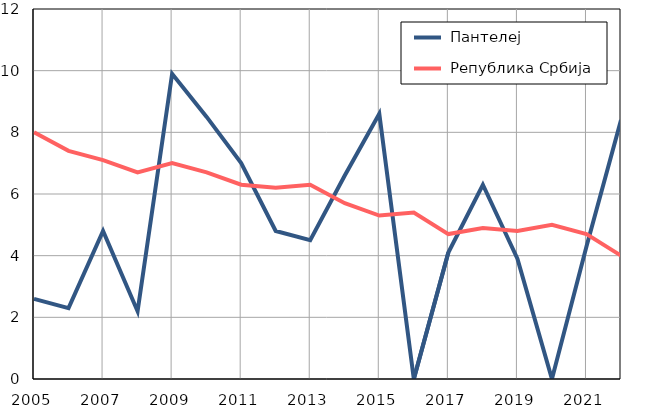
| Category |  Пантелеј |  Република Србија |
|---|---|---|
| 2005.0 | 2.6 | 8 |
| 2006.0 | 2.3 | 7.4 |
| 2007.0 | 4.8 | 7.1 |
| 2008.0 | 2.2 | 6.7 |
| 2009.0 | 9.9 | 7 |
| 2010.0 | 8.5 | 6.7 |
| 2011.0 | 7 | 6.3 |
| 2012.0 | 4.8 | 6.2 |
| 2013.0 | 4.5 | 6.3 |
| 2014.0 | 6.6 | 5.7 |
| 2015.0 | 8.6 | 5.3 |
| 2016.0 | 0 | 5.4 |
| 2017.0 | 4.1 | 4.7 |
| 2018.0 | 6.3 | 4.9 |
| 2019.0 | 3.9 | 4.8 |
| 2020.0 | 0 | 5 |
| 2021.0 | 4.3 | 4.7 |
| 2022.0 | 8.4 | 4 |